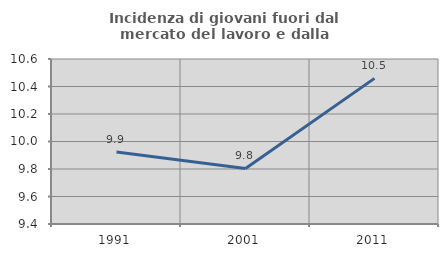
| Category | Incidenza di giovani fuori dal mercato del lavoro e dalla formazione  |
|---|---|
| 1991.0 | 9.924 |
| 2001.0 | 9.804 |
| 2011.0 | 10.459 |